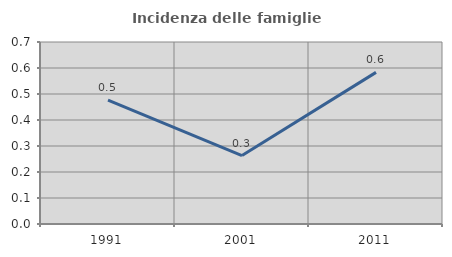
| Category | Incidenza delle famiglie numerose |
|---|---|
| 1991.0 | 0.476 |
| 2001.0 | 0.263 |
| 2011.0 | 0.583 |